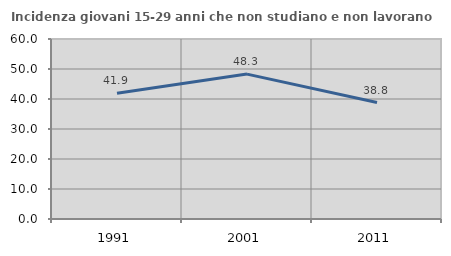
| Category | Incidenza giovani 15-29 anni che non studiano e non lavorano  |
|---|---|
| 1991.0 | 41.948 |
| 2001.0 | 48.299 |
| 2011.0 | 38.817 |